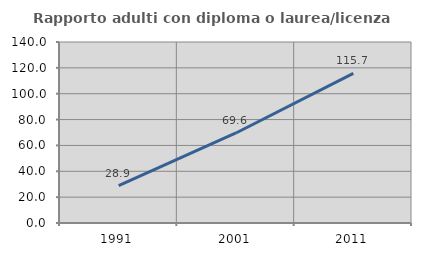
| Category | Rapporto adulti con diploma o laurea/licenza media  |
|---|---|
| 1991.0 | 28.866 |
| 2001.0 | 69.63 |
| 2011.0 | 115.702 |